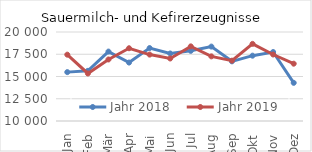
| Category | Jahr 2018 | Jahr 2019 |
|---|---|---|
| Jan | 15491.4 | 17452.867 |
| Feb | 15635.534 | 15340.507 |
| Mär | 17799.741 | 16913.875 |
| Apr | 16566.047 | 18173.992 |
| Mai | 18195.845 | 17463.076 |
| Jun | 17586.289 | 17024.021 |
| Jul | 17882.914 | 18386.065 |
| Aug | 18360.865 | 17262.487 |
| Sep | 16703.956 | 16780.057 |
| Okt | 17339.756 | 18665.601 |
| Nov | 17749.265 | 17471.598 |
| Dez | 14287.704 | 16438.814 |